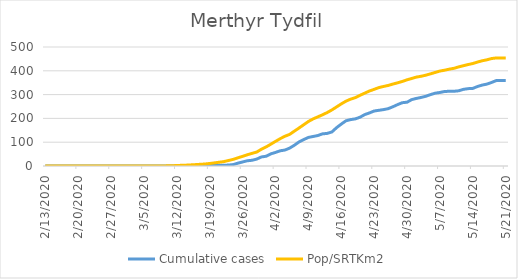
| Category | Cumulative cases | Pop/SRTKm2 |
|---|---|---|
| 5/21/20 | 359 | 454.052 |
| 5/20/20 | 359 | 454.052 |
| 5/19/20 | 359 | 453.946 |
| 5/18/20 | 351 | 451.457 |
| 5/17/20 | 344 | 446.159 |
| 5/16/20 | 340 | 442.213 |
| 5/15/20 | 334 | 436.667 |
| 5/14/20 | 326 | 430.516 |
| 5/13/20 | 325 | 426.249 |
| 5/12/20 | 322 | 421.343 |
| 5/11/20 | 316 | 416.472 |
| 5/10/20 | 314 | 410.428 |
| 5/9/20 | 314 | 406.908 |
| 5/8/20 | 313 | 402.5 |
| 5/7/20 | 309 | 398.944 |
| 5/6/20 | 306 | 393.078 |
| 5/5/20 | 300 | 387.212 |
| 5/4/20 | 293 | 381.559 |
| 5/3/20 | 288 | 377.008 |
| 5/2/20 | 284 | 373.666 |
| 5/1/20 | 279 | 367.729 |
| 4/30/20 | 268 | 362.111 |
| 4/29/20 | 266 | 355.285 |
| 4/28/20 | 258 | 349.49 |
| 4/27/20 | 249 | 344.299 |
| 4/26/20 | 241 | 338.468 |
| 4/25/20 | 237 | 334.237 |
| 4/24/20 | 234 | 329.438 |
| 4/23/20 | 231 | 322.078 |
| 4/22/20 | 223 | 315.038 |
| 4/21/20 | 216 | 306.115 |
| 4/20/20 | 205 | 297.12 |
| 4/19/20 | 198 | 287.342 |
| 4/18/20 | 195 | 281.014 |
| 4/17/20 | 190 | 272.374 |
| 4/16/20 | 176 | 260.926 |
| 4/15/20 | 161 | 248.163 |
| 4/14/20 | 143 | 235.541 |
| 4/13/20 | 137 | 224.52 |
| 4/12/20 | 135 | 215.027 |
| 4/11/20 | 128 | 206.387 |
| 4/10/20 | 124 | 197.712 |
| 4/9/20 | 120 | 187.046 |
| 4/8/20 | 111 | 173.181 |
| 4/7/20 | 101 | 159.564 |
| 4/6/20 | 87 | 146.195 |
| 4/5/20 | 75 | 132.721 |
| 4/4/20 | 67 | 124.863 |
| 4/3/20 | 64 | 114.873 |
| 4/2/20 | 57 | 103.354 |
| 4/1/20 | 51 | 91.514 |
| 3/31/20 | 41 | 80.137 |
| 3/30/20 | 38 | 70.502 |
| 3/29/20 | 29 | 58.628 |
| 3/28/20 | 24 | 53.081 |
| 3/27/20 | 22 | 47.179 |
| 3/26/20 | 17 | 40.602 |
| 3/25/20 | 12 | 34.416 |
| 3/24/20 | 6 | 27.909 |
| 3/23/20 | 4 | 23.11 |
| 3/22/20 | 3 | 18.488 |
| 3/21/20 | 3 | 15.786 |
| 3/20/20 | 2 | 13.119 |
| 3/19/20 | 2 | 10.559 |
| 3/18/20 | 1 | 8.426 |
| 3/17/20 | 1 | 7.182 |
| 3/16/20 | 1 | 5.866 |
| 3/15/20 | 0 | 4.657 |
| 3/14/20 | 0 | 3.626 |
| 3/13/20 | 0 | 2.951 |
| 3/12/20 | 0 | 1.991 |
| 3/11/20 | 0 | 1.138 |
| 3/10/20 | 0 | 0.64 |
| 3/9/20 | 0 | 0.249 |
| 3/8/20 | 0 | 0.142 |
| 3/7/20 | 0 | 0.142 |
| 3/6/20 | 0 | 0.071 |
| 3/5/20 | 0 | 0.071 |
| 3/4/20 | 0 | 0.071 |
| 3/3/20 | 0 | 0.036 |
| 3/2/20 | 0 | 0.036 |
| 3/1/20 | 0 | 0.036 |
| 2/29/20 | 0 | 0.036 |
| 2/28/20 | 0 | 0.036 |
| 2/27/20 | 0 | 0.036 |
| 2/26/20 | 0 | 0 |
| 2/25/20 | 0 | 0 |
| 2/24/20 | 0 | 0 |
| 2/23/20 | 0 | 0 |
| 2/22/20 | 0 | 0 |
| 2/21/20 | 0 | 0 |
| 2/20/20 | 0 | 0 |
| 2/19/20 | 0 | 0 |
| 2/18/20 | 0 | 0 |
| 2/17/20 | 0 | 0 |
| 2/16/20 | 0 | 0 |
| 2/15/20 | 0 | 0 |
| 2/14/20 | 0 | 0 |
| 2/13/20 | 0 | 0 |